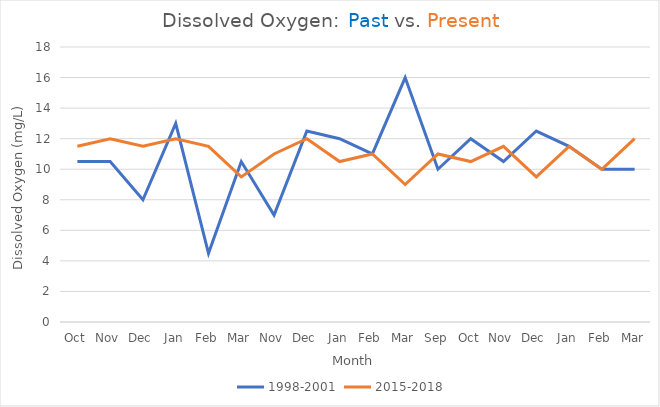
| Category | 1998-2001 | 2015-2018 |
|---|---|---|
| Oct | 10.5 | 11.5 |
| Nov | 10.5 | 12 |
| Dec | 8 | 11.5 |
| Jan | 13 | 12 |
| Feb | 4.5 | 11.5 |
| Mar | 10.5 | 9.5 |
| Nov | 7 | 11 |
| Dec | 12.5 | 12 |
| Jan | 12 | 10.5 |
| Feb | 11 | 11 |
| Mar | 16 | 9 |
| Sep | 10 | 11 |
| Oct | 12 | 10.5 |
| Nov | 10.5 | 11.5 |
| Dec | 12.5 | 9.5 |
| Jan | 11.5 | 11.5 |
| Feb | 10 | 10 |
| Mar | 10 | 12 |